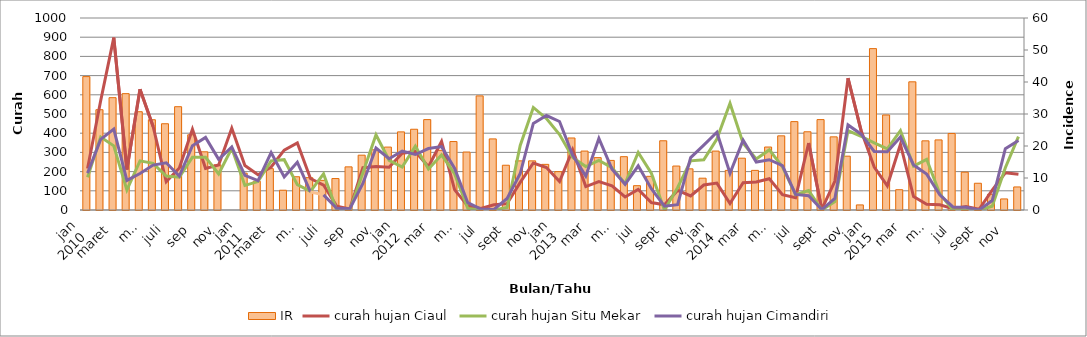
| Category | IR |
|---|---|
| 0 | 41.688 |
| 1 | 31.344 |
| 2 | 35.106 |
| 3 | 36.359 |
| 4 | 30.717 |
| 5 | 28.21 |
| 6 | 26.956 |
| 7 | 32.285 |
| 8 | 23.508 |
| 9 | 18.18 |
| 10 | 14.105 |
| 11 | 0 |
| 12 | 11.514 |
| 13 | 8.987 |
| 14 | 12.918 |
| 15 | 6.178 |
| 16 | 10.391 |
| 17 | 10.11 |
| 18 | 9.267 |
| 19 | 9.829 |
| 20 | 13.48 |
| 21 | 17.131 |
| 22 | 18.816 |
| 23 | 19.658 |
| 24 | 24.41 |
| 25 | 25.233 |
| 26 | 28.25 |
| 27 | 18.65 |
| 28 | 21.393 |
| 29 | 18.102 |
| 30 | 35.655 |
| 31 | 22.216 |
| 32 | 13.988 |
| 33 | 15.359 |
| 34 | 15.359 |
| 35 | 14.262 |
| 36 | 11.985 |
| 37 | 22.509 |
| 38 | 18.417 |
| 39 | 16.37 |
| 40 | 15.493 |
| 41 | 16.663 |
| 42 | 7.601 |
| 43 | 10.524 |
| 44 | 21.632 |
| 45 | 13.739 |
| 46 | 12.862 |
| 47 | 9.939 |
| 48 | 18.413 |
| 49 | 12.381 |
| 50 | 16.19 |
| 51 | 12.381 |
| 52 | 19.682 |
| 53 | 23.175 |
| 54 | 27.619 |
| 55 | 24.444 |
| 56 | 28.254 |
| 57 | 22.857 |
| 58 | 16.825 |
| 59 | 1.587 |
| 60 | 50.432 |
| 61 | 29.683 |
| 62 | 6.34 |
| 63 | 40.058 |
| 64 | 21.614 |
| 65 | 21.902 |
| 66 | 23.919 |
| 67 | 11.816 |
| 68 | 8.357 |
| 69 | 4.899 |
| 70 | 3.458 |
| 71 | 7.205 |